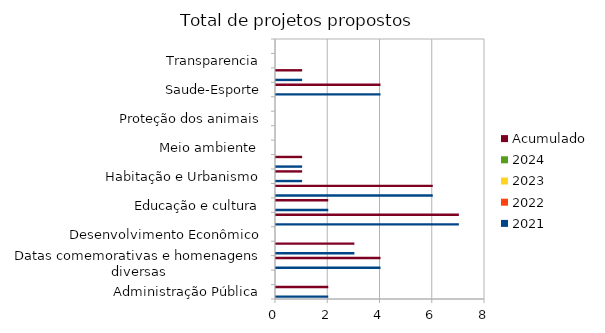
| Category | 2021 | 2022 | 2023 | 2024 | Acumulado |
|---|---|---|---|---|---|
| Administração Pública | 2 |  |  |  | 2 |
| Combate à corrupção  | 0 |  |  |  | 0 |
| Datas comemorativas e homenagens diversas | 4 |  |  |  | 4 |
| Denominação de logradouro | 3 |  |  |  | 3 |
| Desenvolvimento Econômico | 0 |  |  |  | 0 |
| Desenvolvimento Social  | 7 |  |  |  | 7 |
| Educação e cultura | 2 |  |  |  | 2 |
| Frente parlamentar | 6 |  |  |  | 6 |
| Habitação e Urbanismo | 1 |  |  |  | 1 |
| Lei Orgânica do Município | 1 |  |  |  | 1 |
| Meio ambiente  | 0 |  |  |  | 0 |
| Mobilidade | 0 |  |  |  | 0 |
| Proteção dos animais | 0 |  |  |  | 0 |
| Regimento Interno da CMSP | 0 |  |  |  | 0 |
| Saude-Esporte | 4 |  |  |  | 4 |
| Segurança Pública | 1 |  |  |  | 1 |
| Transparencia | 0 |  |  |  | 0 |
| Tributação | 0 |  |  |  | 0 |